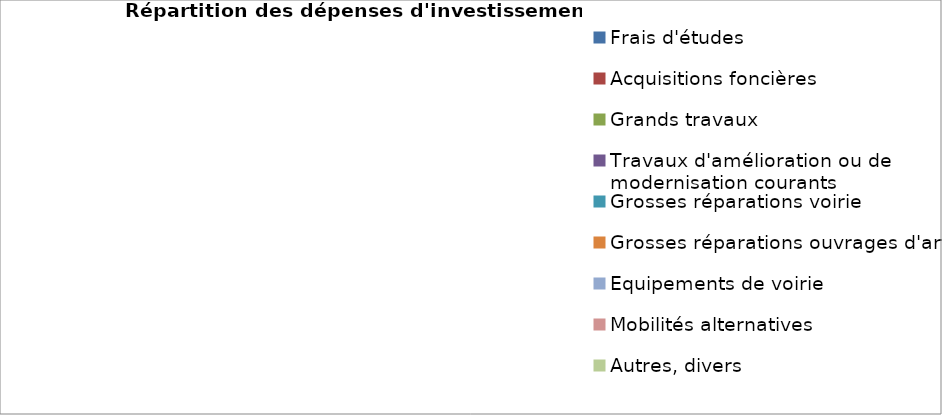
| Category | Series 0 |
|---|---|
| Frais d'études | 0 |
| Acquisitions foncières | 0 |
| Grands travaux | 0 |
| Travaux d'amélioration ou de modernisation courants | 0 |
| Grosses réparations voirie | 0 |
| Grosses réparations ouvrages d'art | 0 |
| Equipements de voirie | 0 |
| Mobilités alternatives  | 0 |
| Autres, divers | 0 |